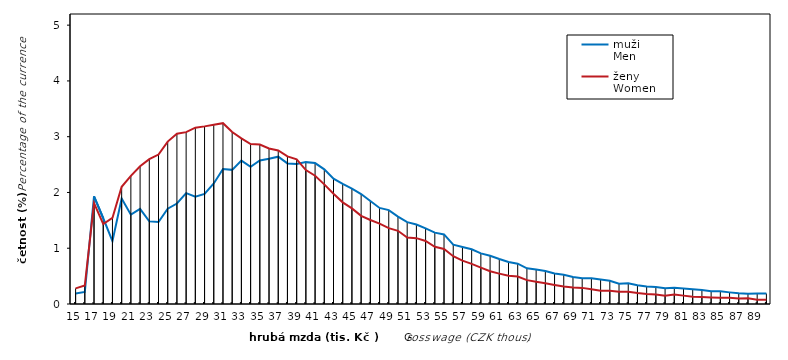
| Category | muži 
Men | ženy
Women |
|---|---|---|
| 15.0 | 0.19 | 0.28 |
| 16.0 | 0.215 | 0.331 |
| 17.0 | 1.931 | 1.81 |
| 18.0 | 1.538 | 1.434 |
| 19.0 | 1.127 | 1.543 |
| 20.0 | 1.893 | 2.102 |
| 21.0 | 1.602 | 2.298 |
| 22.0 | 1.705 | 2.469 |
| 23.0 | 1.481 | 2.596 |
| 24.0 | 1.47 | 2.679 |
| 25.0 | 1.709 | 2.912 |
| 26.0 | 1.802 | 3.052 |
| 27.0 | 1.988 | 3.082 |
| 28.0 | 1.922 | 3.161 |
| 29.0 | 1.975 | 3.185 |
| 30.0 | 2.162 | 3.215 |
| 31.0 | 2.42 | 3.242 |
| 32.0 | 2.405 | 3.083 |
| 33.0 | 2.571 | 2.97 |
| 34.0 | 2.462 | 2.867 |
| 35.0 | 2.573 | 2.859 |
| 36.0 | 2.603 | 2.79 |
| 37.0 | 2.642 | 2.753 |
| 38.0 | 2.521 | 2.648 |
| 39.0 | 2.509 | 2.593 |
| 40.0 | 2.544 | 2.402 |
| 41.0 | 2.527 | 2.299 |
| 42.0 | 2.415 | 2.145 |
| 43.0 | 2.246 | 1.977 |
| 44.0 | 2.153 | 1.823 |
| 45.0 | 2.068 | 1.714 |
| 46.0 | 1.971 | 1.581 |
| 47.0 | 1.847 | 1.507 |
| 48.0 | 1.722 | 1.442 |
| 49.0 | 1.684 | 1.36 |
| 50.0 | 1.567 | 1.312 |
| 51.0 | 1.468 | 1.193 |
| 52.0 | 1.426 | 1.181 |
| 53.0 | 1.357 | 1.131 |
| 54.0 | 1.279 | 1.025 |
| 55.0 | 1.247 | 0.986 |
| 56.0 | 1.065 | 0.857 |
| 57.0 | 1.023 | 0.778 |
| 58.0 | 0.982 | 0.72 |
| 59.0 | 0.908 | 0.653 |
| 60.0 | 0.864 | 0.587 |
| 61.0 | 0.807 | 0.545 |
| 62.0 | 0.754 | 0.505 |
| 63.0 | 0.723 | 0.492 |
| 64.0 | 0.64 | 0.428 |
| 65.0 | 0.62 | 0.397 |
| 66.0 | 0.591 | 0.371 |
| 67.0 | 0.547 | 0.342 |
| 68.0 | 0.524 | 0.315 |
| 69.0 | 0.485 | 0.296 |
| 70.0 | 0.462 | 0.289 |
| 71.0 | 0.463 | 0.265 |
| 72.0 | 0.439 | 0.236 |
| 73.0 | 0.417 | 0.237 |
| 74.0 | 0.363 | 0.218 |
| 75.0 | 0.371 | 0.219 |
| 76.0 | 0.335 | 0.197 |
| 77.0 | 0.313 | 0.179 |
| 78.0 | 0.306 | 0.169 |
| 79.0 | 0.283 | 0.149 |
| 80.0 | 0.29 | 0.17 |
| 81.0 | 0.277 | 0.15 |
| 82.0 | 0.266 | 0.13 |
| 83.0 | 0.25 | 0.124 |
| 84.0 | 0.231 | 0.117 |
| 85.0 | 0.228 | 0.114 |
| 86.0 | 0.208 | 0.113 |
| 87.0 | 0.191 | 0.098 |
| 88.0 | 0.182 | 0.104 |
| 89.0 | 0.187 | 0.078 |
| 90.0 | 0.187 | 0.077 |